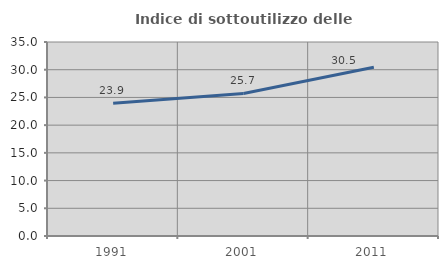
| Category | Indice di sottoutilizzo delle abitazioni  |
|---|---|
| 1991.0 | 23.932 |
| 2001.0 | 25.723 |
| 2011.0 | 30.457 |